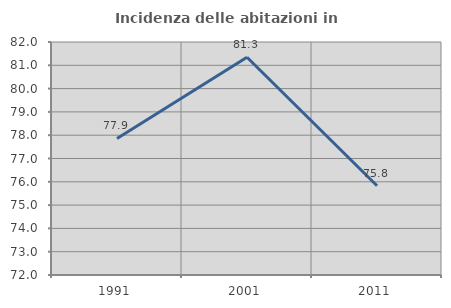
| Category | Incidenza delle abitazioni in proprietà  |
|---|---|
| 1991.0 | 77.859 |
| 2001.0 | 81.346 |
| 2011.0 | 75.829 |